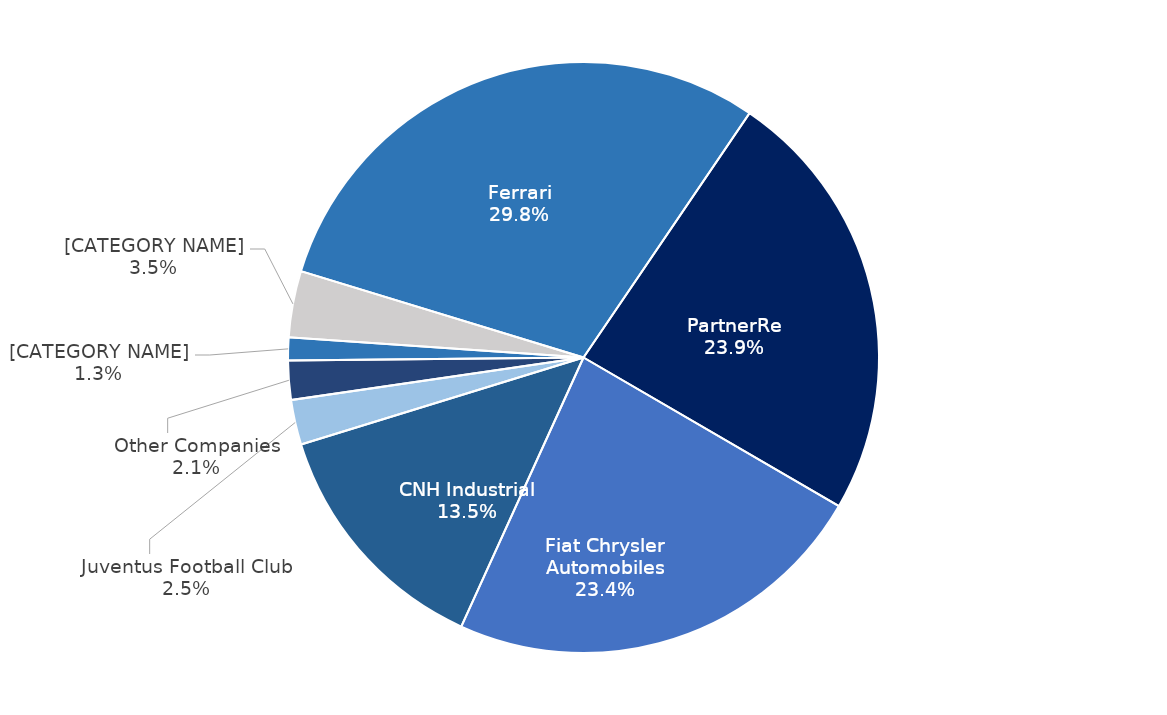
| Category | Series 0 |
|---|---|
| Ferrari | 10286 |
| PartnerRe | 8250 |
| Fiat Chrysler Automobiles | 8085 |
| CNH Industrial | 4649 |
| Juventus Football Club | 848 |
| Other Companies | 741 |
| Partnerships, Seeds & other investments | 429 |
| Others | 1256 |